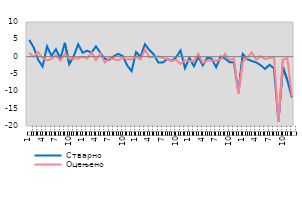
| Category | Стварно | Оцењено |
|---|---|---|
| 0 | 4.858 | 1.077 |
| 1900-01-01 | 2.661 | -0.035 |
| 1900-01-02 | -0.869 | 1.274 |
| 1900-01-03 | -2.837 | -0.338 |
| 1900-01-04 | 2.968 | -1.047 |
| 1900-01-05 | 0.223 | -0.686 |
| 1900-01-06 | 2.149 | 0.498 |
| 1900-01-07 | -0.505 | -1.119 |
| 1900-01-08 | 3.989 | 0.855 |
| 1900-01-09 | -2.169 | -0.585 |
| 1900-01-10 | 0.153 | -0.496 |
| 1900-01-11 | 3.57 | -0.525 |
| 1900-01-12 | 1.132 | 0.016 |
| 1900-01-13 | 1.717 | -0.582 |
| 1900-01-14 | 1.191 | 1.187 |
| 1900-01-15 | 2.98 | -0.974 |
| 1900-01-16 | 1.068 | 0.915 |
| 1900-01-17 | -0.636 | -1.7 |
| 1900-01-18 | -0.911 | -0.41 |
| 1900-01-19 | 0.103 | -0.734 |
| 1900-01-20 | 0.82 | -0.997 |
| 1900-01-21 | 0.191 | -0.353 |
| 1900-01-22 | -2.505 | -0.788 |
| 1900-01-23 | -4.177 | -0.746 |
| 1900-01-24 | 1.297 | -0.036 |
| 1900-01-25 | 0.005 | -0.793 |
| 1900-01-26 | 3.581 | 2.065 |
| 1900-01-27 | 1.91 | -0.198 |
| 1900-01-28 | 0.65 | -0.079 |
| 1900-01-29 | -1.712 | 0.078 |
| 1900-01-30 | -1.719 | -0.338 |
| 1900-01-31 | -0.648 | -0.728 |
| 1900-02-01 | -1.193 | -1.241 |
| 1900-02-02 | -0.199 | -0.88 |
| 1900-02-03 | 1.768 | -2.082 |
| 1900-02-04 | -3.324 | -1.016 |
| 1900-02-05 | -0.308 | -1.211 |
| 1900-02-06 | -2.778 | -1.36 |
| 1900-02-07 | -0.042 | 0.824 |
| 1900-02-08 | -2.506 | -1.776 |
| 1900-02-09 | -0.31 | -1.15 |
| 1900-02-10 | -0.565 | -1.092 |
| 1900-02-11 | -3.069 | -1.111 |
| 1900-02-12 | 0.009 | -0.861 |
| 1900-02-13 | -0.56 | 0.822 |
| 1900-02-14 | -1.577 | -0.938 |
| 1900-02-15 | -1.628 | -0.527 |
| 1900-02-16 | -10.366 | -10.636 |
| 1900-02-17 | 0.76 | -1.362 |
| 1900-02-18 | -0.76 | -0.276 |
| 1900-02-19 | -1.241 | 1.233 |
| 1900-02-20 | -1.679 | -0.851 |
| 1900-02-21 | -2.448 | 0.186 |
| 1900-02-22 | -3.531 | -0.69 |
| 1900-02-23 | -2.338 | -0.373 |
| 1900-02-24 | -3.34 | -0.165 |
| 1900-02-25 | -18.695 | -18.789 |
| 1900-02-26 | -2.908 | -0.85 |
| 1900-02-27 | -6.803 | -0.397 |
| 1900-02-28 | -11.767 | -11.472 |